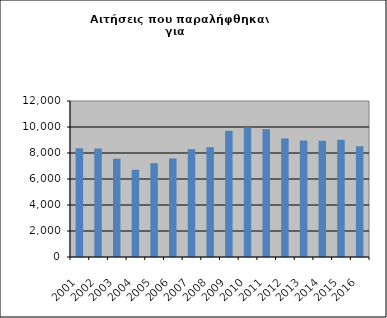
| Category | Series 0 |
|---|---|
| 2001.0 | 8373 |
| 2002.0 | 8343 |
| 2003.0 | 7552 |
| 2004.0 | 6712 |
| 2005.0 | 7219 |
| 2006.0 | 7583 |
| 2007.0 | 8298 |
| 2008.0 | 8442 |
| 2009.0 | 9709 |
| 2010.0 | 9961 |
| 2011.0 | 9830 |
| 2012.0 | 9120 |
| 2013.0 | 8963 |
| 2014.0 | 8939 |
| 2015.0 | 9015 |
| 2016.0 | 8517 |